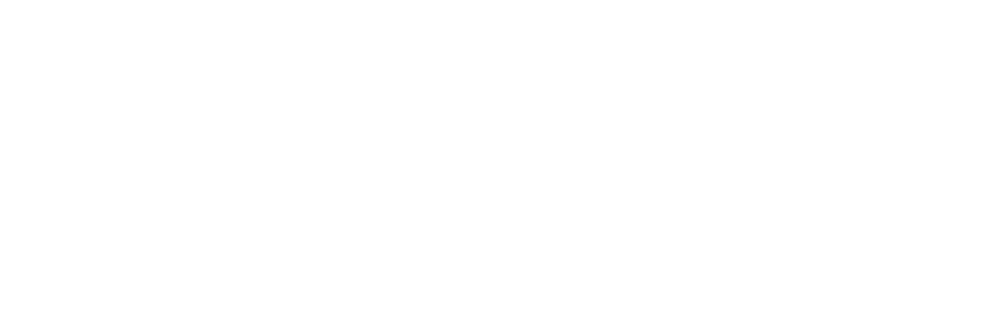
| Category | Total |
|---|---|
| 0 | 0.026 |
| 1 | 0.093 |
| 2 | 0.325 |
| 3 | 0.325 |
| 4 | 0.231 |
| 5 | 0.014 |
| 6 | 0.032 |
| 7 | 0.207 |
| 8 | 0.43 |
| 9 | 0.317 |
| 10 | 0.009 |
| 11 | 0.044 |
| 12 | 0.234 |
| 13 | 0.442 |
| 14 | 0.271 |